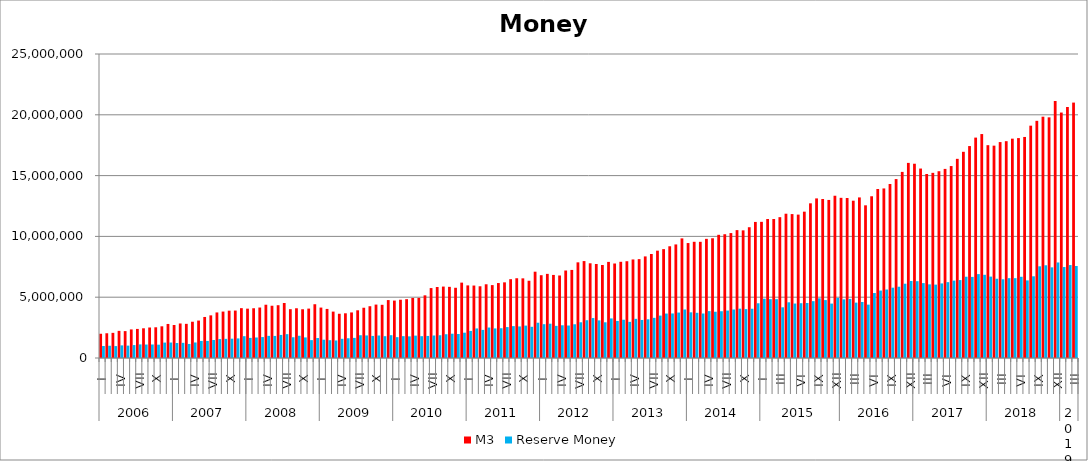
| Category | M3 | Reserve Money |
|---|---|---|
| 0 | 1993635.252 | 985529.837 |
| 1 | 2034234.826 | 1006861.291 |
| 2 | 2068041.342 | 981188.537 |
| 3 | 2231719.944 | 1037670.32 |
| 4 | 2211726.006 | 1017229.525 |
| 5 | 2350643.488 | 1063055.584 |
| 6 | 2391487.856 | 1117976.357 |
| 7 | 2443084.258 | 1106750.341 |
| 8 | 2508732.57 | 1112012.223 |
| 9 | 2525728.196 | 1095465.011 |
| 10 | 2606222.861 | 1267573.815 |
| 11 | 2799779.664 | 1272098.537 |
| 12 | 2712080.574 | 1232053.134 |
| 13 | 2839247.957 | 1248398.16 |
| 14 | 2809129.727 | 1153980.424 |
| 15 | 2983302.624 | 1277207.234 |
| 16 | 3078896.375 | 1403307.841 |
| 17 | 3374827.695 | 1404077.538 |
| 18 | 3507235.628 | 1479672.329 |
| 19 | 3747060.191 | 1555771.96 |
| 20 | 3818751.76 | 1574900.45 |
| 21 | 3892352.971 | 1588923.076 |
| 22 | 3901496.079 | 1610500.365 |
| 23 | 4098857.212 | 1793802.01 |
| 24 | 4058253.618 | 1652937.267 |
| 25 | 4091244.212 | 1686843.876 |
| 26 | 4150553.585 | 1722001.473 |
| 27 | 4381379.554 | 1820171.278 |
| 28 | 4298190.088 | 1815126.575 |
| 29 | 4341414.027 | 1897531.247 |
| 30 | 4525406.244 | 1960868.235 |
| 31 | 4014687.917 | 1706188.166 |
| 32 | 4089682.299 | 1828526.98 |
| 33 | 4009512.363 | 1691326.122 |
| 34 | 4062943.074 | 1470551.675 |
| 35 | 4421698.466 | 1642080.787 |
| 36 | 4146756.21 | 1505078.055 |
| 37 | 4035788.433 | 1464069.396 |
| 38 | 3815625.073 | 1441942.103 |
| 39 | 3637932.132 | 1578292.367 |
| 40 | 3676519.248 | 1622579.421 |
| 41 | 3746883.705 | 1654014.811 |
| 42 | 3922696.007 | 1872828.703 |
| 43 | 4133600.643 | 1856192.394 |
| 44 | 4258468.82 | 1815233.312 |
| 45 | 4392845.734 | 1850711.225 |
| 46 | 4374192.684 | 1794464.923 |
| 47 | 4763606.912 | 1874961.354 |
| 48 | 4721982.505 | 1713536.285 |
| 49 | 4792163.56 | 1796688.9 |
| 50 | 4837431.557 | 1779992.609 |
| 51 | 4938622.79 | 1840471.316 |
| 52 | 4945487.009 | 1794174.909 |
| 53 | 5154387.443 | 1814725.803 |
| 54 | 5750227.904 | 1850494.326 |
| 55 | 5840047.26 | 1871816.662 |
| 56 | 5874149.127 | 1954729.072 |
| 57 | 5852007.985 | 1997836.737 |
| 58 | 5775636.555 | 1975036.135 |
| 59 | 6199008.806 | 2081128.752 |
| 60 | 5970729.983 | 2226103.832 |
| 61 | 5959087.97 | 2430168.133 |
| 62 | 5899005.704 | 2311380.782 |
| 63 | 6062639.273 | 2505955.775 |
| 64 | 5995136.02 | 2432249.082 |
| 65 | 6164201.229 | 2448706.203 |
| 66 | 6221284.913 | 2542648.036 |
| 67 | 6481689.318 | 2621687.544 |
| 68 | 6558253.631 | 2595533.261 |
| 69 | 6550014.362 | 2664580.778 |
| 70 | 6352920.652 | 2566552.114 |
| 71 | 7097777.273 | 2901038.828 |
| 72 | 6808396.175 | 2780440.849 |
| 73 | 6918705.592 | 2819931.093 |
| 74 | 6831744.234 | 2642386.812 |
| 75 | 6785908.965 | 2691389.762 |
| 76 | 7194518.793 | 2671575.273 |
| 77 | 7242926.553 | 2775361.632 |
| 78 | 7867540.374 | 2937987.976 |
| 79 | 7971705.487 | 3107541.586 |
| 80 | 7789118.852 | 3285540.123 |
| 81 | 7732668.513 | 3094823.14 |
| 82 | 7648449.547 | 2937213.459 |
| 83 | 7903738.971 | 3255313.659 |
| 84 | 7771222.7 | 3047796.187 |
| 85 | 7912345.956 | 3146225.813 |
| 86 | 7959105.687 | 2972028.987 |
| 87 | 8103469.276 | 3220089.371 |
| 88 | 8130730.824 | 3129434.801 |
| 89 | 8354699.149 | 3184262.276 |
| 90 | 8553410.296 | 3302037.366 |
| 91 | 8826582.176 | 3487678.696 |
| 92 | 8953801.477 | 3655478.769 |
| 93 | 9188613.332 | 3663277.537 |
| 94 | 9339568.079 | 3737236.26 |
| 95 | 9836618.601 | 3989083.317 |
| 96 | 9453972.937 | 3756141.816 |
| 97 | 9556546.423 | 3717320.784 |
| 98 | 9555304.952 | 3659706.219 |
| 99 | 9799048.091 | 3855909.639 |
| 100 | 9846212.502 | 3804159.071 |
| 101 | 10130909.316 | 3846993.656 |
| 102 | 10178205.898 | 3901000.343 |
| 103 | 10273632.539 | 3988861.155 |
| 104 | 10516743.129 | 4056513.111 |
| 105 | 10497444.423 | 4020878.96 |
| 106 | 10754604.791 | 4050811.645 |
| 107 | 11189835.906 | 4501009.92 |
| 108 | 11197675.774 | 4875122.328 |
| 109 | 11430746.277 | 4837812.334 |
| 110 | 11430746.277 | 4837812.334 |
| 111 | 11581239.857 | 4169036.036 |
| 112 | 11865515.017 | 4580597.986 |
| 113 | 11835307.744 | 4478239.223 |
| 114 | 11792213.073 | 4505863.791 |
| 115 | 12034462.526 | 4525163.426 |
| 116 | 12720190.151 | 4674624.879 |
| 117 | 13124203.995 | 4907397.413 |
| 118 | 13073662.228 | 4763122.409 |
| 119 | 12998223.563 | 4474717.337 |
| 120 | 13343921.268 | 4948158.146 |
| 121 | 13172033.37 | 4823667.329 |
| 122 | 13155832.444 | 4858795.624 |
| 123 | 12936581.332 | 4553776.684 |
| 124 | 13206213.457 | 4606530.89 |
| 125 | 12555625.602 | 4388431.419 |
| 126 | 13300944.539 | 5343112.251 |
| 127 | 13897993.631 | 5546009.052 |
| 128 | 13943466.797 | 5631585.796 |
| 129 | 14309304.721 | 5782125.992 |
| 130 | 14713510.721 | 5860814.898 |
| 131 | 15304596.052 | 6108426.466 |
| 132 | 16045200.01 | 6332535.477 |
| 133 | 15976224.093 | 6317838.859 |
| 134 | 15580104.218 | 6159989.306 |
| 135 | 15132806.692 | 6056015.159 |
| 136 | 15226347.996 | 6034338.878 |
| 137 | 15360147.87 | 6133256.108 |
| 138 | 15550758.151 | 6238062.995 |
| 139 | 15785246.683 | 6363688.254 |
| 140 | 16378805.759 | 6408158.005 |
| 141 | 16957721.336 | 6683210.873 |
| 142 | 17429301.938 | 6668622.166 |
| 143 | 18125077.324 | 6898984.047 |
| 144 | 18416278.044 | 6842923.373 |
| 145 | 17501935.182 | 6693637.928 |
| 146 | 17463278.92 | 6517959.429 |
| 147 | 17756925.753 | 6474034.831 |
| 148 | 17830710.048 | 6565140.29 |
| 149 | 18037847.494 | 6564370.705 |
| 150 | 18084477.007 | 6679239.605 |
| 151 | 18177750.876 | 6382996.535 |
| 152 | 19106163.443 | 6719330.301 |
| 153 | 19504220.662 | 7540075.346 |
| 154 | 19844384.427 | 7626348.916 |
| 155 | 19790399 | 7454554.982 |
| 156 | 21124724.422 | 7856508.693 |
| 157 | 20185423.438 | 7480228.155 |
| 158 | 20641124.454 | 7643276.903 |
| 159 | 21004242.435 | 7563905.671 |